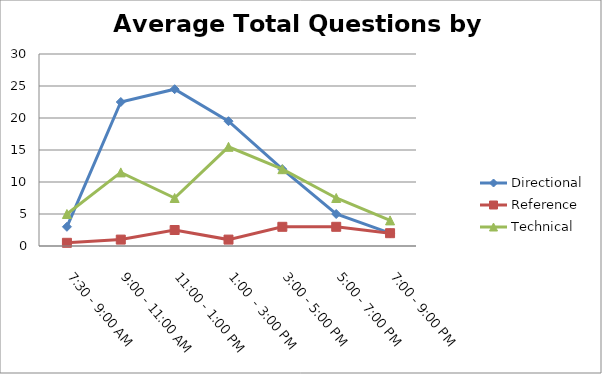
| Category | Directional | Reference | Technical |
|---|---|---|---|
| 7:30 - 9:00 AM | 3 | 0.5 | 5 |
| 9:00 - 11:00 AM | 22.5 | 1 | 11.5 |
| 11:00 - 1:00 PM | 24.5 | 2.5 | 7.5 |
| 1:00  - 3:00 PM | 19.5 | 1 | 15.5 |
| 3:00 - 5:00 PM | 12 | 3 | 12 |
| 5:00 - 7:00 PM | 5 | 3 | 7.5 |
| 7:00 - 9:00 PM | 2 | 2 | 4 |